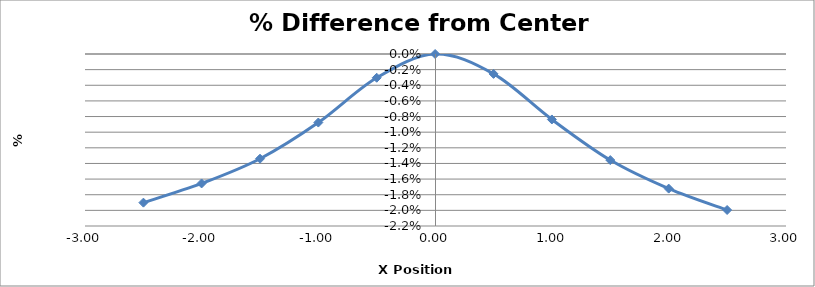
| Category | Series 0 |
|---|---|
| -2.5 | -0.019 |
| -2.002 | -0.017 |
| -1.5019999999999998 | -0.013 |
| -1.0030000000000001 | -0.009 |
| -0.5030000000000001 | -0.003 |
| -0.0030000000000001137 | 0 |
| 0.4969999999999999 | -0.003 |
| 0.9959999999999996 | -0.008 |
| 1.4959999999999996 | -0.014 |
| 1.9959999999999996 | -0.017 |
| 2.4959999999999996 | -0.02 |